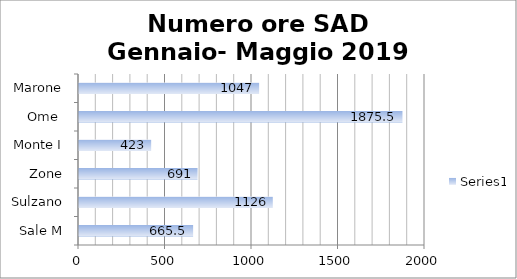
| Category | Series 0 |
|---|---|
| Sale M | 665.5 |
| Sulzano | 1126 |
| Zone | 691 |
| Monte I | 423 |
| Ome  | 1875.5 |
| Marone | 1047 |